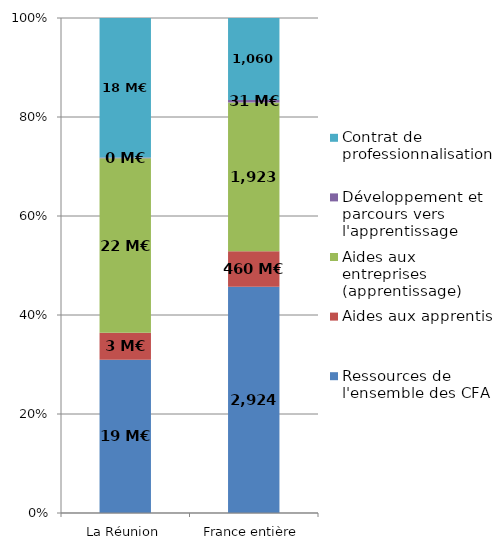
| Category | Ressources de l'ensemble des CFA | Aides aux apprentis | Aides aux entreprises (apprentissage) | Développement et parcours vers l'apprentissage | Contrat de professionnalisation |
|---|---|---|---|---|---|
| La Réunion | 19.309 | 3.401 | 21.982 | 0.113 | 17.565 |
| France entière | 2924.219 | 459.796 | 1923.184 | 31.421 | 1060.48 |